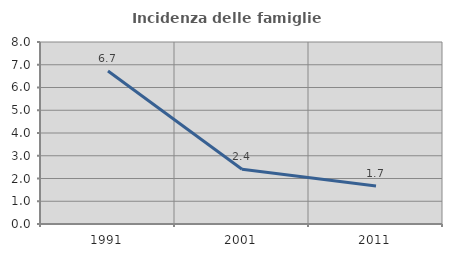
| Category | Incidenza delle famiglie numerose |
|---|---|
| 1991.0 | 6.724 |
| 2001.0 | 2.408 |
| 2011.0 | 1.669 |